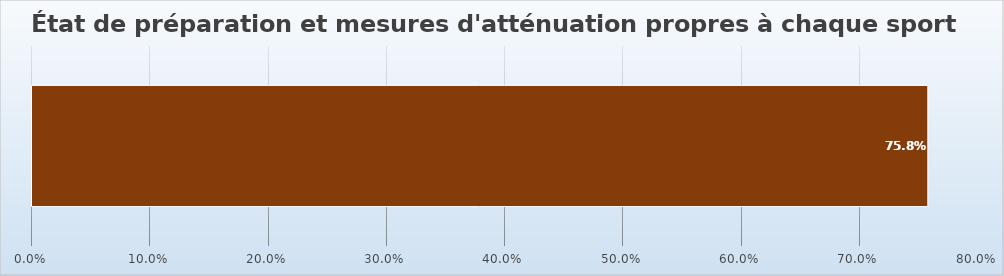
| Category | Series 0 |
|---|---|
| 0 | 0.758 |